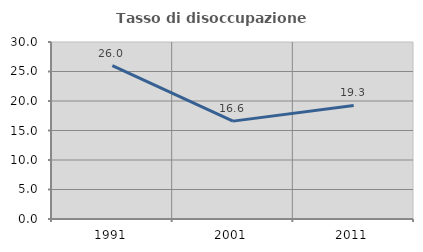
| Category | Tasso di disoccupazione giovanile  |
|---|---|
| 1991.0 | 25.98 |
| 2001.0 | 16.588 |
| 2011.0 | 19.251 |